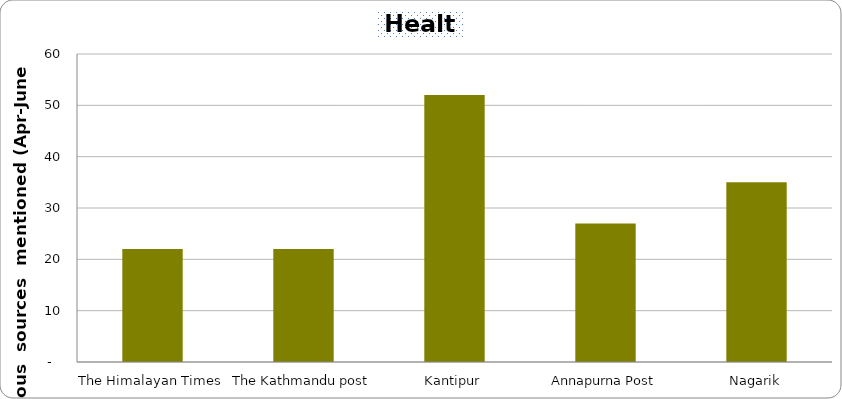
| Category | Health |
|---|---|
| The Himalayan Times | 22 |
| The Kathmandu post | 22 |
| Kantipur | 52 |
| Annapurna Post | 27 |
| Nagarik | 35 |